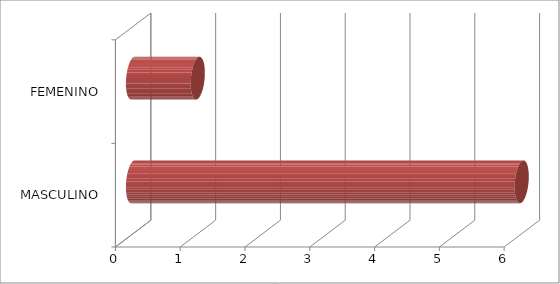
| Category | Series 0 |
|---|---|
| MASCULINO | 6 |
| FEMENINO | 1 |